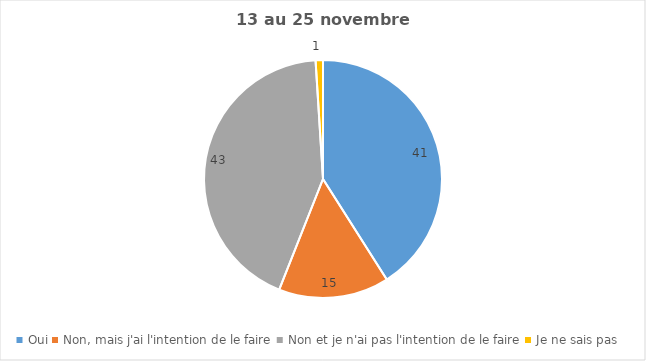
| Category | Series 0 |
|---|---|
| Oui | 41 |
| Non, mais j'ai l'intention de le faire | 15 |
| Non et je n'ai pas l'intention de le faire | 43 |
| Je ne sais pas | 1 |